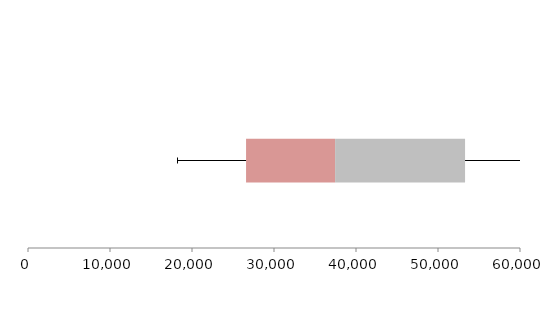
| Category | Series 1 | Series 2 | Series 3 |
|---|---|---|---|
| 0 | 26592.189 | 10859.266 | 15847.874 |